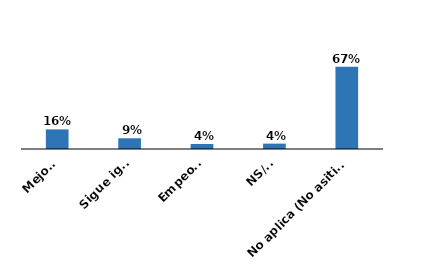
| Category | Series 0 |
|---|---|
| Mejoró | 0.159 |
| Sigue igual | 0.087 |
| Empeoró | 0.041 |
| NS/NR | 0.044 |
| No aplica (No asitió anteriormente) | 0.669 |